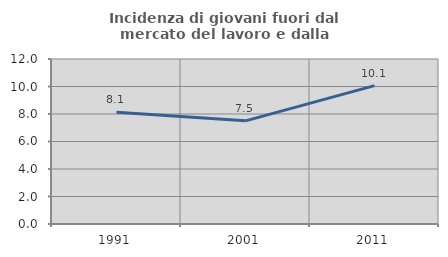
| Category | Incidenza di giovani fuori dal mercato del lavoro e dalla formazione  |
|---|---|
| 1991.0 | 8.125 |
| 2001.0 | 7.502 |
| 2011.0 | 10.064 |